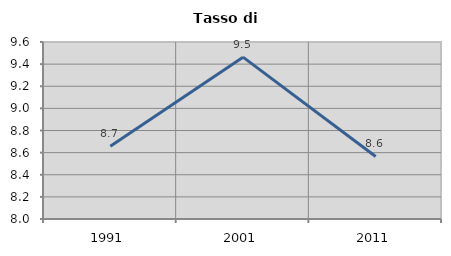
| Category | Tasso di disoccupazione   |
|---|---|
| 1991.0 | 8.658 |
| 2001.0 | 9.463 |
| 2011.0 | 8.565 |